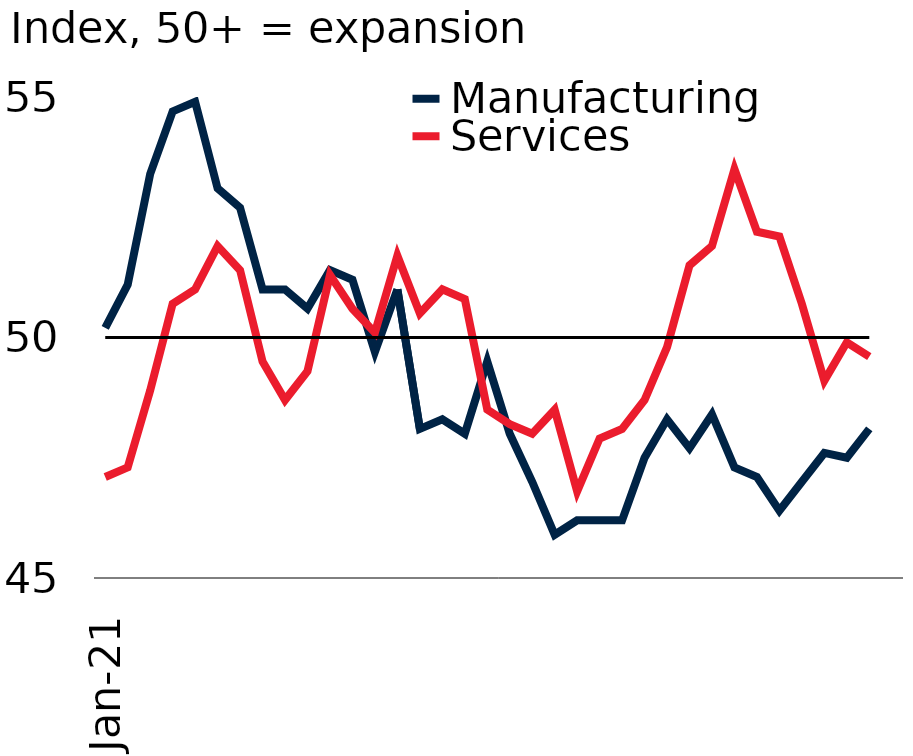
| Category | Manufacturing | Services | Series 2 |
|---|---|---|---|
| 2021-01-01 | 50.2 | 47.1 | 50 |
| 2021-02-01 | 51.1 | 47.3 | 50 |
| 2021-03-01 | 53.4 | 48.9 | 50 |
| 2021-04-01 | 54.7 | 50.7 | 50 |
| 2021-05-01 | 54.9 | 51 | 50 |
| 2021-06-01 | 53.1 | 51.9 | 50 |
| 2021-07-01 | 52.7 | 51.4 | 50 |
| 2021-08-01 | 51 | 49.5 | 50 |
| 2021-09-01 | 51 | 48.7 | 50 |
| 2021-10-01 | 50.6 | 49.3 | 50 |
| 2021-11-01 | 51.4 | 51.3 | 50 |
| 2021-12-01 | 51.2 | 50.6 | 50 |
| 2022-01-01 | 49.7 | 50.1 | 50 |
| 2022-02-01 | 51 | 51.7 | 50 |
| 2022-03-01 | 48.1 | 50.5 | 50 |
| 2022-04-01 | 48.3 | 51 | 50 |
| 2022-05-01 | 48 | 50.8 | 50 |
| 2022-06-01 | 49.5 | 48.5 | 50 |
| 2022-07-01 | 48 | 48.2 | 50 |
| 2022-08-01 | 47 | 48 | 50 |
| 2022-09-01 | 45.9 | 48.5 | 50 |
| 2022-10-01 | 46.2 | 46.8 | 50 |
| 2022-11-01 | 46.2 | 47.9 | 50 |
| 2022-12-01 | 46.2 | 48.1 | 50 |
| 2023-01-01 | 47.5 | 48.7 | 50 |
| 2023-02-01 | 48.3 | 49.8 | 50 |
| 2023-03-01 | 47.7 | 51.5 | 50 |
| 2023-04-01 | 48.4 | 51.9 | 50 |
| 2023-05-01 | 47.3 | 53.5 | 50 |
| 2023-06-01 | 47.1 | 52.2 | 50 |
| 2023-07-01 | 46.4 | 52.1 | 50 |
| 2023-08-01 | 47 | 50.7 | 50 |
| 2023-09-01 | 47.6 | 49.1 | 50 |
| 2023-10-01 | 47.5 | 49.9 | 50 |
| 2023-11-01 | 48.1 | 49.6 | 50 |